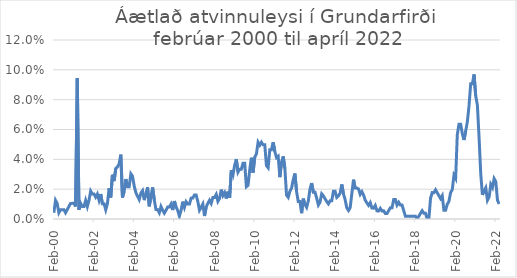
| Category | Series 0 |
|---|---|
| 2000-02-01 | 0.004 |
| 2000-03-01 | 0.013 |
| 2000-04-01 | 0.01 |
| 2000-05-01 | 0.004 |
| 2000-06-01 | 0.006 |
| 2000-07-01 | 0.006 |
| 2000-08-01 | 0.006 |
| 2000-09-01 | 0.004 |
| 2000-10-01 | 0.006 |
| 2000-11-01 | 0.008 |
| 2000-12-01 | 0.01 |
| 2001-01-01 | 0.01 |
| 2001-02-01 | 0.01 |
| 2001-03-01 | 0.008 |
| 2001-04-01 | 0.094 |
| 2001-05-01 | 0.006 |
| 2001-06-01 | 0.01 |
| 2001-07-01 | 0.008 |
| 2001-08-01 | 0.008 |
| 2001-09-01 | 0.012 |
| 2001-10-01 | 0.008 |
| 2001-11-01 | 0.012 |
| 2001-12-01 | 0.019 |
| 2002-01-01 | 0.017 |
| 2002-02-01 | 0.017 |
| 2002-03-01 | 0.015 |
| 2002-04-01 | 0.017 |
| 2002-05-01 | 0.013 |
| 2002-06-01 | 0.017 |
| 2002-07-01 | 0.01 |
| 2002-08-01 | 0.01 |
| 2002-09-01 | 0.006 |
| 2002-10-01 | 0.01 |
| 2002-11-01 | 0.021 |
| 2002-12-01 | 0.014 |
| 2003-01-01 | 0.03 |
| 2003-02-01 | 0.025 |
| 2003-03-01 | 0.034 |
| 2003-04-01 | 0.035 |
| 2003-05-01 | 0.037 |
| 2003-06-01 | 0.043 |
| 2003-07-01 | 0.014 |
| 2003-08-01 | 0.019 |
| 2003-09-01 | 0.027 |
| 2003-10-01 | 0.022 |
| 2003-11-01 | 0.022 |
| 2003-12-01 | 0.03 |
| 2004-01-01 | 0.029 |
| 2004-02-01 | 0.022 |
| 2004-03-01 | 0.018 |
| 2004-04-01 | 0.015 |
| 2004-05-01 | 0.013 |
| 2004-06-01 | 0.017 |
| 2004-07-01 | 0.019 |
| 2004-08-01 | 0.013 |
| 2004-09-01 | 0.017 |
| 2004-10-01 | 0.021 |
| 2004-11-01 | 0.009 |
| 2004-12-01 | 0.015 |
| 2005-01-01 | 0.021 |
| 2005-02-01 | 0.013 |
| 2005-03-01 | 0.006 |
| 2005-04-01 | 0.006 |
| 2005-05-01 | 0.004 |
| 2005-06-01 | 0.008 |
| 2005-07-01 | 0.006 |
| 2005-08-01 | 0.004 |
| 2005-09-01 | 0.006 |
| 2005-10-01 | 0.008 |
| 2005-11-01 | 0.008 |
| 2005-12-01 | 0.01 |
| 2006-01-01 | 0.006 |
| 2006-02-01 | 0.012 |
| 2006-03-01 | 0.008 |
| 2006-04-01 | 0.006 |
| 2006-05-01 | 0.002 |
| 2006-06-01 | 0.006 |
| 2006-07-01 | 0.012 |
| 2006-08-01 | 0.008 |
| 2006-09-01 | 0.012 |
| 2006-10-01 | 0.01 |
| 2006-11-01 | 0.01 |
| 2006-12-01 | 0.014 |
| 2007-01-01 | 0.014 |
| 2007-02-01 | 0.016 |
| 2007-03-01 | 0.016 |
| 2007-04-01 | 0.012 |
| 2007-05-01 | 0.006 |
| 2007-06-01 | 0.008 |
| 2007-07-01 | 0.01 |
| 2007-08-01 | 0.002 |
| 2007-09-01 | 0.008 |
| 2007-10-01 | 0.01 |
| 2007-11-01 | 0.013 |
| 2007-12-01 | 0.01 |
| 2008-01-01 | 0.014 |
| 2008-02-01 | 0.014 |
| 2008-03-01 | 0.016 |
| 2008-04-01 | 0.012 |
| 2008-05-01 | 0.014 |
| 2008-06-01 | 0.02 |
| 2008-07-01 | 0.016 |
| 2008-08-01 | 0.018 |
| 2008-09-01 | 0.014 |
| 2008-10-01 | 0.018 |
| 2008-11-01 | 0.014 |
| 2008-12-01 | 0.033 |
| 2009-01-01 | 0.03 |
| 2009-02-01 | 0.036 |
| 2009-03-01 | 0.04 |
| 2009-04-01 | 0.031 |
| 2009-05-01 | 0.033 |
| 2009-06-01 | 0.033 |
| 2009-07-01 | 0.037 |
| 2009-08-01 | 0.037 |
| 2009-09-01 | 0.022 |
| 2009-10-01 | 0.023 |
| 2009-11-01 | 0.033 |
| 2009-12-01 | 0.041 |
| 2010-01-01 | 0.031 |
| 2010-02-01 | 0.041 |
| 2010-03-01 | 0.044 |
| 2010-04-01 | 0.051 |
| 2010-05-01 | 0.05 |
| 2010-06-01 | 0.051 |
| 2010-07-01 | 0.05 |
| 2010-08-01 | 0.05 |
| 2010-09-01 | 0.036 |
| 2010-10-01 | 0.034 |
| 2010-11-01 | 0.046 |
| 2010-12-01 | 0.046 |
| 2011-01-01 | 0.051 |
| 2011-02-01 | 0.045 |
| 2011-03-01 | 0.041 |
| 2011-04-01 | 0.042 |
| 2011-05-01 | 0.028 |
| 2011-06-01 | 0.038 |
| 2011-07-01 | 0.042 |
| 2011-08-01 | 0.034 |
| 2011-09-01 | 0.016 |
| 2011-10-01 | 0.014 |
| 2011-11-01 | 0.019 |
| 2011-12-01 | 0.021 |
| 2012-01-01 | 0.026 |
| 2012-02-01 | 0.03 |
| 2012-03-01 | 0.018 |
| 2012-04-01 | 0.012 |
| 2012-05-01 | 0.012 |
| 2012-06-01 | 0.004 |
| 2012-07-01 | 0.014 |
| 2012-08-01 | 0.01 |
| 2012-09-01 | 0.008 |
| 2012-10-01 | 0.012 |
| 2012-11-01 | 0.02 |
| 2012-12-01 | 0.024 |
| 2013-01-01 | 0.018 |
| 2013-02-01 | 0.018 |
| 2013-03-01 | 0.014 |
| 2013-04-01 | 0.009 |
| 2013-05-01 | 0.011 |
| 2013-06-01 | 0.017 |
| 2013-07-01 | 0.016 |
| 2013-08-01 | 0.014 |
| 2013-09-01 | 0.012 |
| 2013-10-01 | 0.01 |
| 2013-11-01 | 0.012 |
| 2013-12-01 | 0.012 |
| 2014-01-01 | 0.019 |
| 2014-02-01 | 0.019 |
| 2014-03-01 | 0.014 |
| 2014-04-01 | 0.015 |
| 2014-05-01 | 0.017 |
| 2014-06-01 | 0.023 |
| 2014-07-01 | 0.017 |
| 2014-08-01 | 0.013 |
| 2014-09-01 | 0.007 |
| 2014-10-01 | 0.006 |
| 2014-11-01 | 0.008 |
| 2014-12-01 | 0.017 |
| 2015-01-01 | 0.026 |
| 2015-02-01 | 0.021 |
| 2015-03-01 | 0.021 |
| 2015-04-01 | 0.02 |
| 2015-05-01 | 0.017 |
| 2015-06-01 | 0.018 |
| 2015-07-01 | 0.016 |
| 2015-08-01 | 0.013 |
| 2015-09-01 | 0.011 |
| 2015-10-01 | 0.009 |
| 2015-11-01 | 0.011 |
| 2015-12-01 | 0.007 |
| 2016-01-01 | 0.007 |
| 2016-02-01 | 0.009 |
| 2016-03-01 | 0.005 |
| 2016-04-01 | 0.005 |
| 2016-05-01 | 0.007 |
| 2016-06-01 | 0.005 |
| 2016-07-01 | 0.006 |
| 2016-08-01 | 0.004 |
| 2016-09-01 | 0.004 |
| 2016-10-01 | 0.006 |
| 2016-11-01 | 0.007 |
| 2016-12-01 | 0.007 |
| 2017-01-01 | 0.013 |
| 2017-02-01 | 0.013 |
| 2017-03-01 | 0.009 |
| 2017-04-01 | 0.011 |
| 2017-05-01 | 0.009 |
| 2017-06-01 | 0.009 |
| 2017-07-01 | 0.006 |
| 2017-08-01 | 0.002 |
| 2017-09-01 | 0.002 |
| 2017-10-01 | 0.002 |
| 2017-11-01 | 0.002 |
| 2017-12-01 | 0.002 |
| 2018-01-01 | 0.002 |
| 2018-02-01 | 0.002 |
| 2018-03-01 | 0 |
| 2018-04-01 | 0.002 |
| 2018-05-01 | 0.004 |
| 2018-06-01 | 0.006 |
| 2018-07-01 | 0.004 |
| 2018-08-01 | 0.004 |
| 2018-09-01 | 0 |
| 2018-10-01 | 0 |
| 2018-11-01 | 0.014 |
| 2018-12-01 | 0.018 |
| 2019-01-01 | 0.018 |
| 2019-02-01 | 0.02 |
| 2019-03-01 | 0.018 |
| 2019-04-01 | 0.016 |
| 2019-05-01 | 0.014 |
| 2019-06-01 | 0.016 |
| 2019-07-01 | 0.006 |
| 2019-08-01 | 0.006 |
| 2019-09-01 | 0.01 |
| 2019-10-01 | 0.012 |
| 2019-11-01 | 0.018 |
| 2019-12-01 | 0.02 |
| 2020-01-01 | 0.029 |
| 2020-02-01 | 0.027 |
| 2020-03-01 | 0.057 |
| 2020-04-01 | 0.064 |
| 2020-05-01 | 0.064 |
| 2020-06-01 | 0.057 |
| 2020-07-01 | 0.053 |
| 2020-08-01 | 0.059 |
| 2020-09-01 | 0.065 |
| 2020-10-01 | 0.076 |
| 2020-11-01 | 0.091 |
| 2020-12-01 | 0.091 |
| 2021-01-01 | 0.097 |
| 2021-02-01 | 0.082 |
| 2021-03-01 | 0.076 |
| 2021-04-01 | 0.055 |
| 2021-05-01 | 0.03 |
| 2021-06-01 | 0.016 |
| 2021-07-01 | 0.019 |
| 2021-08-01 | 0.021 |
| 2021-09-01 | 0.013 |
| 2021-10-01 | 0.015 |
| 2021-11-01 | 0.023 |
| 2021-12-01 | 0.021 |
| 2022-01-01 | 0.027 |
| 2022-02-01 | 0.025 |
| 2022-03-01 | 0.012 |
| 2022-04-01 | 0.01 |